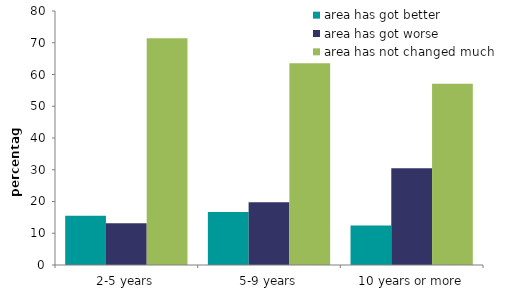
| Category | area has got better | area has got worse | area has not changed much |
|---|---|---|---|
| 2-5 years | 15.485 | 13.119 | 71.396 |
| 5-9 years | 16.706 | 19.768 | 63.526 |
| 10 years or more | 12.418 | 30.487 | 57.095 |